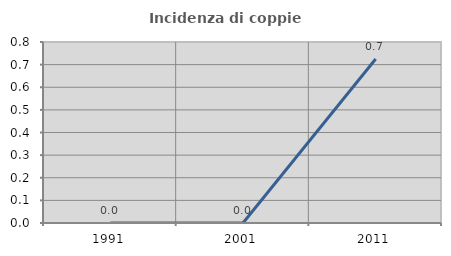
| Category | Incidenza di coppie miste |
|---|---|
| 1991.0 | 0 |
| 2001.0 | 0 |
| 2011.0 | 0.725 |